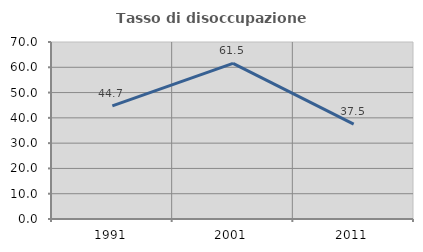
| Category | Tasso di disoccupazione giovanile  |
|---|---|
| 1991.0 | 44.737 |
| 2001.0 | 61.538 |
| 2011.0 | 37.5 |